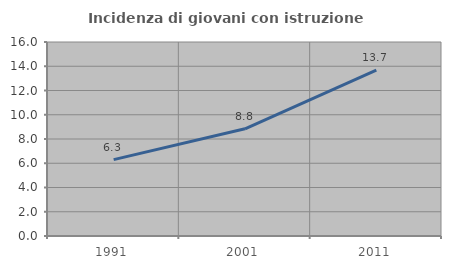
| Category | Incidenza di giovani con istruzione universitaria |
|---|---|
| 1991.0 | 6.297 |
| 2001.0 | 8.842 |
| 2011.0 | 13.671 |